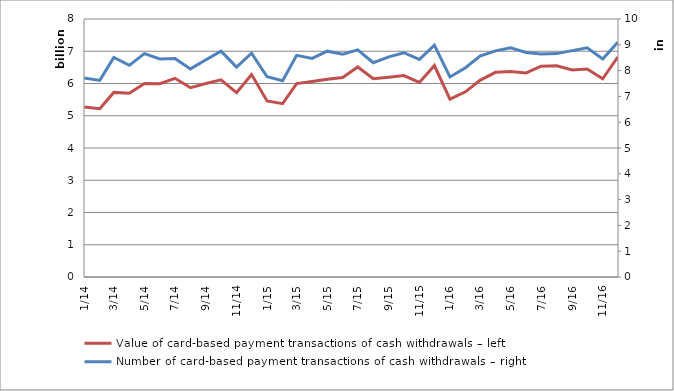
| Category | Value of card-based payment transactions of cash withdrawals – left |
|---|---|
| 2014-01-01 | 5272832195 |
| 2014-02-01 | 5217719073 |
| 2014-03-01 | 5724015061 |
| 2014-04-01 | 5698926512 |
| 2014-05-01 | 6001990751 |
| 2014-06-01 | 5993565769 |
| 2014-07-01 | 6160371954 |
| 2014-08-01 | 5870871418 |
| 2014-09-01 | 6000906784 |
| 2014-10-01 | 6113250340 |
| 2014-11-01 | 5715360378 |
| 2014-12-01 | 6276631519 |
| 2015-01-01 | 5458088979 |
| 2015-02-01 | 5373333911 |
| 2015-03-01 | 5996120795 |
| 2015-04-01 | 6061776852 |
| 2015-05-01 | 6134160830 |
| 2015-06-01 | 6184116986 |
| 2015-07-01 | 6513775021 |
| 2015-08-01 | 6150274026 |
| 2015-09-01 | 6195261234 |
| 2015-10-01 | 6243935908 |
| 2015-11-01 | 6032039906 |
| 2015-12-01 | 6556319206 |
| 2016-01-01 | 5514464401 |
| 2016-02-01 | 5741517621 |
| 2016-03-01 | 6097170475 |
| 2016-04-01 | 6346534978 |
| 2016-05-01 | 6370574517 |
| 2016-06-01 | 6327736639 |
| 2016-07-01 | 6535488468 |
| 2016-08-01 | 6551751429 |
| 2016-09-01 | 6421891372 |
| 2016-10-01 | 6450142057 |
| 2016-11-01 | 6145659859 |
| 2016-12-01 | 6819331904 |